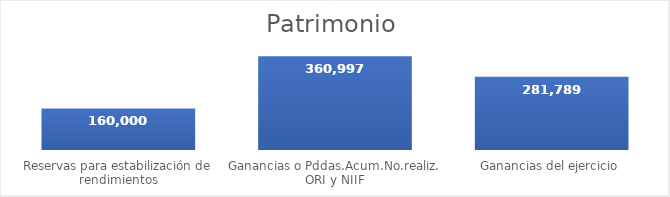
| Category | Valor |
|---|---|
| Reservas para estabilización de rendimientos | 160000 |
| Ganancias o Pddas.Acum.No.realiz. ORI y NIIF | 360997 |
| Ganancias del ejercicio | 281789 |